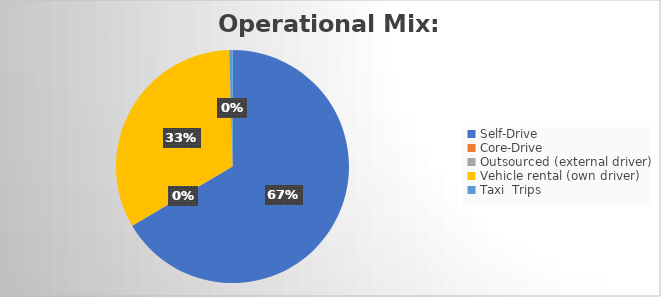
| Category | Distance |
|---|---|
| Self-Drive | 1198 |
| Core-Drive | 0 |
| Outsourced (external driver) | 0 |
| Vehicle rental (own driver) | 595 |
| Taxi  Trips | 8 |